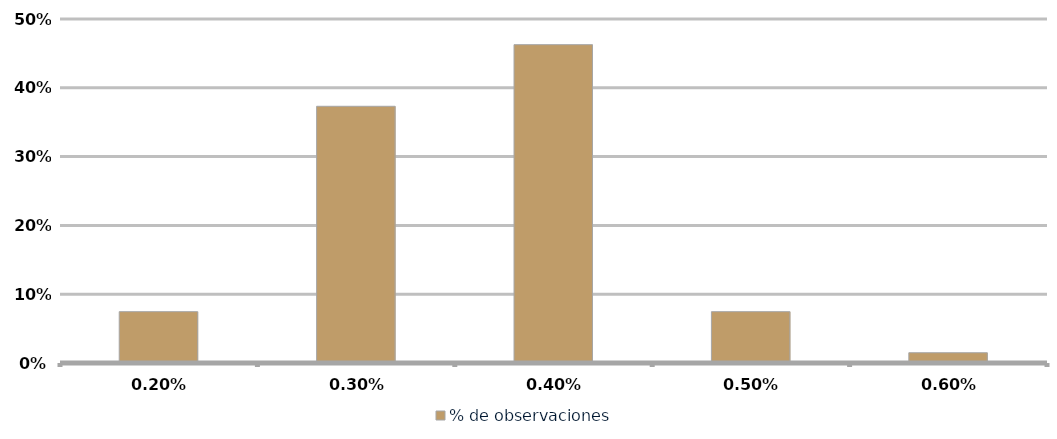
| Category | % de observaciones  |
|---|---|
| 0.002 | 0.075 |
| 0.003 | 0.373 |
| 0.004 | 0.463 |
| 0.005 | 0.075 |
| 0.006 | 0.015 |